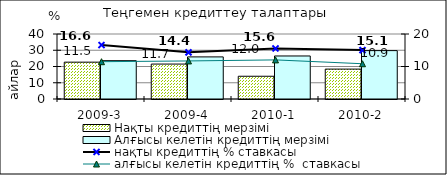
| Category | Нақты кредиттің мерзімі  | Алғысы келетін кредиттің мерзімі  |
|---|---|---|
| 2009-3 | 22.67 | 23.58 |
| 2009-4 | 21.5 | 25.91 |
| 2010-1 | 14 | 26.48 |
| 2010-2 | 18.4 | 29.78 |